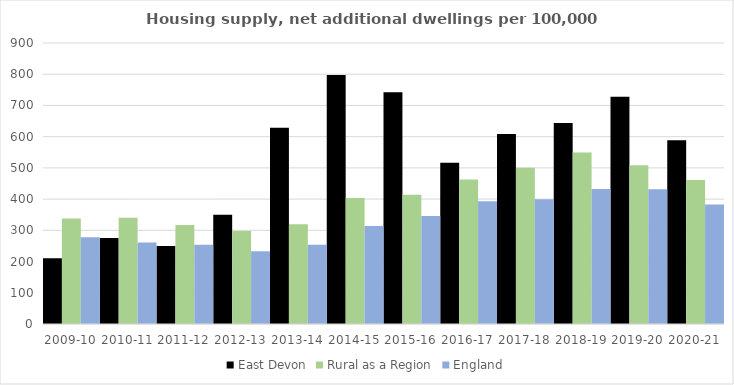
| Category | East Devon | Rural as a Region | England |
|---|---|---|---|
| 2009-10 | 210.363 | 337.852 | 277.548 |
| 2010-11 | 275.681 | 340.105 | 260.994 |
| 2011-12 | 249.865 | 317.04 | 254.007 |
| 2012-13 | 349.624 | 297.763 | 233.153 |
| 2013-14 | 628.675 | 319.835 | 253.602 |
| 2014-15 | 797.697 | 403.796 | 314.256 |
| 2015-16 | 742.159 | 414.091 | 346.154 |
| 2016-17 | 516.144 | 463.209 | 393.256 |
| 2017-18 | 608.723 | 500.68 | 399.646 |
| 2018-19 | 643.722 | 549.491 | 432.099 |
| 2019-20 | 728.036 | 508.493 | 431.187 |
| 2020-21 | 588.871 | 461.114 | 382.827 |